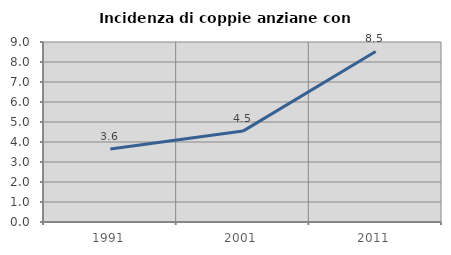
| Category | Incidenza di coppie anziane con figli |
|---|---|
| 1991.0 | 3.65 |
| 2001.0 | 4.545 |
| 2011.0 | 8.527 |